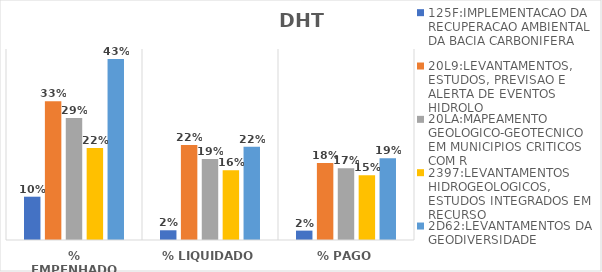
| Category | 125F:IMPLEMENTACAO DA RECUPERACAO AMBIENTAL DA BACIA CARBONIFERA | 20L9:LEVANTAMENTOS, ESTUDOS, PREVISAO E ALERTA DE EVENTOS HIDROLO | 20LA:MAPEAMENTO GEOLOGICO-GEOTECNICO EM MUNICIPIOS CRITICOS COM R | 2397:LEVANTAMENTOS HIDROGEOLOGICOS, ESTUDOS INTEGRADOS EM RECURSO | 2D62:LEVANTAMENTOS DA GEODIVERSIDADE |
|---|---|---|---|---|---|
| % EMPENHADO | 0.102 | 0.327 | 0.288 | 0.217 | 0.427 |
| % LIQUIDADO | 0.023 | 0.224 | 0.191 | 0.164 | 0.22 |
| % PAGO | 0.022 | 0.181 | 0.169 | 0.153 | 0.192 |